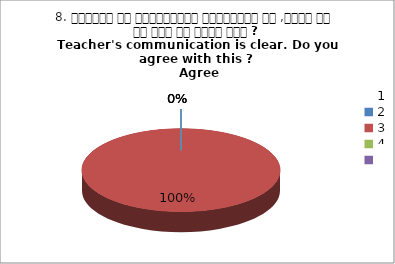
| Category | 8. शिक्षक का सम्प्रेषण सुस्पष्ठ है ,क्या आप इस बात से सहमत हैं ?
Teacher's communication is clear. Do you agree with this ? 
 Agree |
|---|---|
| 0 | 0 |
| 1 | 1 |
| 2 | 0 |
| 3 | 0 |
| 4 | 0 |